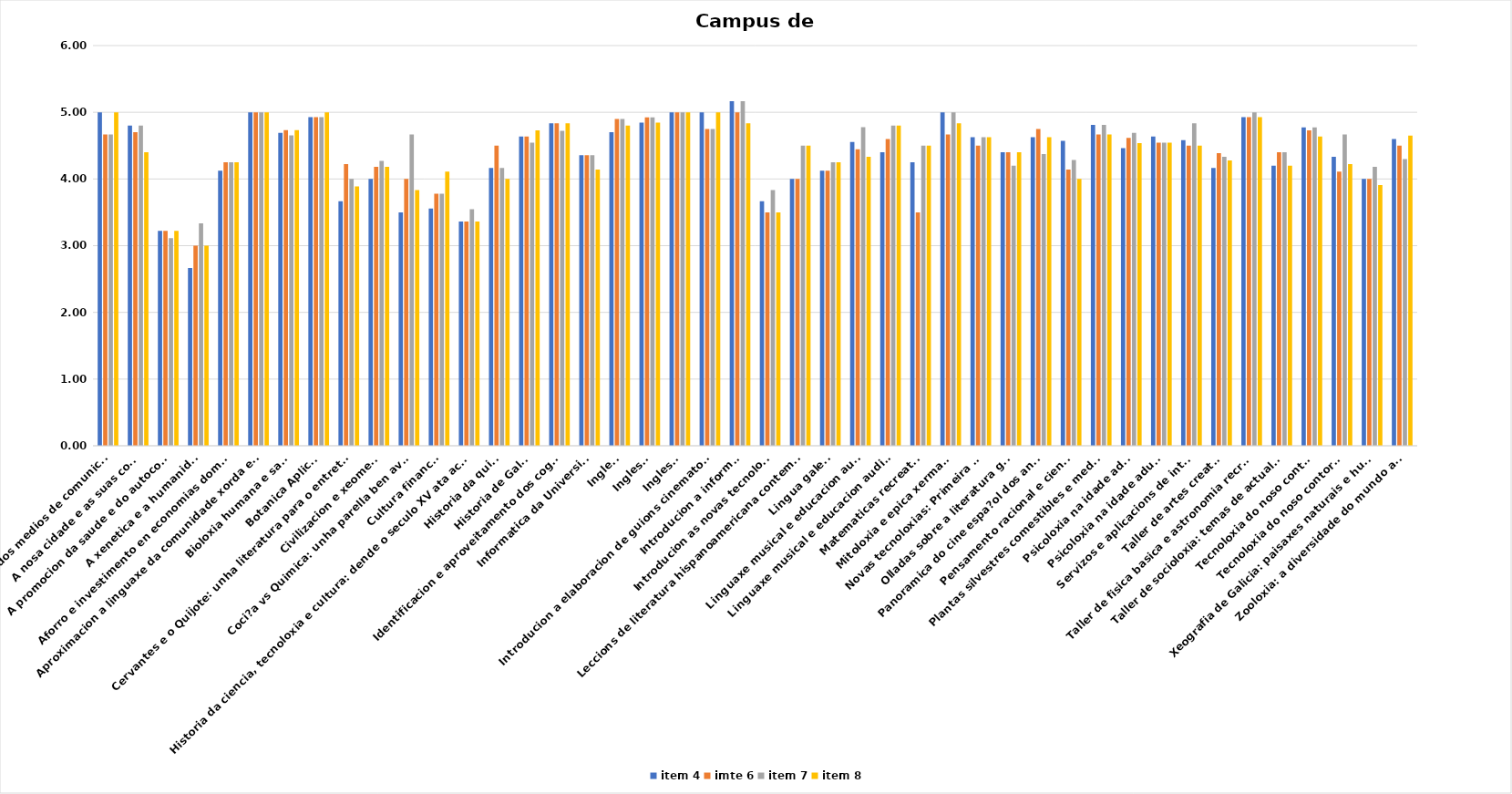
| Category | item 4 | imte 6 | item 7 | item 8 |
|---|---|---|---|---|
| A linguaxe dos medios de comunicacion | 5 | 4.667 | 4.667 | 5 |
| A nosa cidade e as suas cousas | 4.8 | 4.7 | 4.8 | 4.4 |
| A promocion da saude e do autocoidado | 3.222 | 3.222 | 3.111 | 3.222 |
| A xenetica e a humanidade | 2.667 | 3 | 3.333 | 3 |
| Aforro e investimento en economias domesticas | 4.125 | 4.25 | 4.25 | 4.25 |
| Aproximacion a linguaxe da comunidade xorda espa?ola | 5 | 5 | 5 | 5 |
| Bioloxia humana e saude | 4.692 | 4.731 | 4.654 | 4.731 |
| Botanica Aplicada | 4.929 | 4.929 | 4.929 | 5 |
| Cervantes e o Quijote: unha literatura para o entretemento | 3.667 | 4.222 | 4 | 3.889 |
| Civilizacion e xeometria | 4 | 4.182 | 4.273 | 4.182 |
| Coci?a vs Quimica: unha parella ben avenida | 3.5 | 4 | 4.667 | 3.833 |
| Cultura financeira | 3.556 | 3.778 | 3.778 | 4.111 |
| Historia da ciencia, tecnoloxia e cultura: dende o seculo XV ata actualidade | 3.364 | 3.364 | 3.545 | 3.364 |
| Historia da quimica | 4.167 | 4.5 | 4.167 | 4 |
| Historia de Galicia | 4.636 | 4.636 | 4.545 | 4.727 |
| Identificacion e aproveitamento dos cogomelos | 4.833 | 4.833 | 4.722 | 4.833 |
| Informatica da Universidade | 4.357 | 4.357 | 4.357 | 4.143 |
| Ingles I | 4.7 | 4.9 | 4.9 | 4.8 |
| Ingles II | 4.846 | 4.923 | 4.923 | 4.846 |
| Ingles III | 5 | 5 | 5 | 5 |
| Introducion a elaboracion de guions cinematograficos | 5 | 4.75 | 4.75 | 5 |
| Introducion a informatica | 5.167 | 5 | 5.167 | 4.833 |
| Introducion as novas tecnoloxias II | 3.667 | 3.5 | 3.833 | 3.5 |
| Leccions de literatura hispanoamericana contemporanea | 4 | 4 | 4.5 | 4.5 |
| Lingua galega | 4.125 | 4.125 | 4.25 | 4.25 |
| Linguaxe musical e educacion auditiva | 4.556 | 4.444 | 4.778 | 4.333 |
| Linguaxe musical e educacion auditiva II | 4.4 | 4.6 | 4.8 | 4.8 |
| Matematicas recreativas | 4.25 | 3.5 | 4.5 | 4.5 |
| Mitoloxia e epica xermanicas | 5 | 4.667 | 5 | 4.833 |
| Novas tecnoloxias: Primeira parte | 4.625 | 4.5 | 4.625 | 4.625 |
| Olladas sobre a literatura galega | 4.4 | 4.4 | 4.2 | 4.4 |
| Panoramica do cine espa?ol dos anos 50 | 4.625 | 4.75 | 4.375 | 4.625 |
| Pensamento racional e cientifico | 4.571 | 4.143 | 4.286 | 4 |
| Plantas silvestres comestibles e medicinais | 4.81 | 4.667 | 4.81 | 4.667 |
| Psicoloxia na idade adulta I | 4.462 | 4.615 | 4.692 | 4.538 |
| Psicoloxia na idade adulta II | 4.636 | 4.545 | 4.545 | 4.545 |
| Servizos e aplicacions de internet | 4.583 | 4.5 | 4.833 | 4.5 |
| Taller de artes creativas | 4.167 | 4.389 | 4.333 | 4.278 |
| Taller de fisica basica e astronomia recreativa | 4.929 | 4.929 | 5 | 4.929 |
| Taller de socioloxia: temas de actualidade | 4.2 | 4.4 | 4.4 | 4.2 |
| Tecnoloxia do noso contorno | 4.773 | 4.727 | 4.773 | 4.636 |
| Tecnoloxia do noso contorno II | 4.333 | 4.111 | 4.667 | 4.222 |
| Xeografia de Galicia: paisaxes naturais e humanas | 4 | 4 | 4.182 | 3.909 |
| Zooloxia: a diversidade do mundo animal | 4.6 | 4.5 | 4.3 | 4.65 |